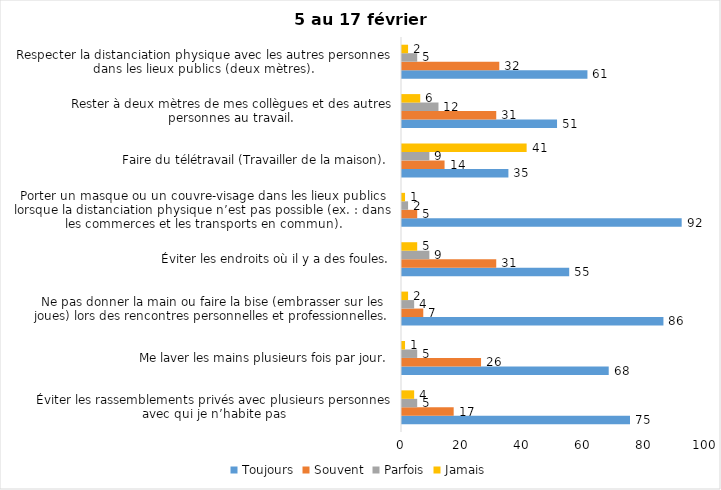
| Category | Toujours | Souvent | Parfois | Jamais |
|---|---|---|---|---|
| Éviter les rassemblements privés avec plusieurs personnes avec qui je n’habite pas | 75 | 17 | 5 | 4 |
| Me laver les mains plusieurs fois par jour. | 68 | 26 | 5 | 1 |
| Ne pas donner la main ou faire la bise (embrasser sur les joues) lors des rencontres personnelles et professionnelles. | 86 | 7 | 4 | 2 |
| Éviter les endroits où il y a des foules. | 55 | 31 | 9 | 5 |
| Porter un masque ou un couvre-visage dans les lieux publics lorsque la distanciation physique n’est pas possible (ex. : dans les commerces et les transports en commun). | 92 | 5 | 2 | 1 |
| Faire du télétravail (Travailler de la maison). | 35 | 14 | 9 | 41 |
| Rester à deux mètres de mes collègues et des autres personnes au travail. | 51 | 31 | 12 | 6 |
| Respecter la distanciation physique avec les autres personnes dans les lieux publics (deux mètres). | 61 | 32 | 5 | 2 |